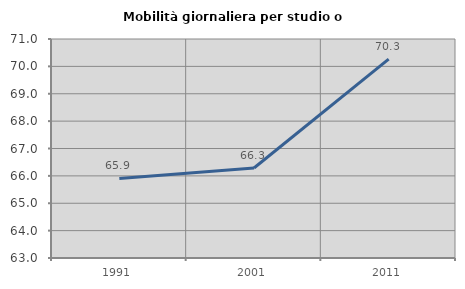
| Category | Mobilità giornaliera per studio o lavoro |
|---|---|
| 1991.0 | 65.905 |
| 2001.0 | 66.288 |
| 2011.0 | 70.265 |